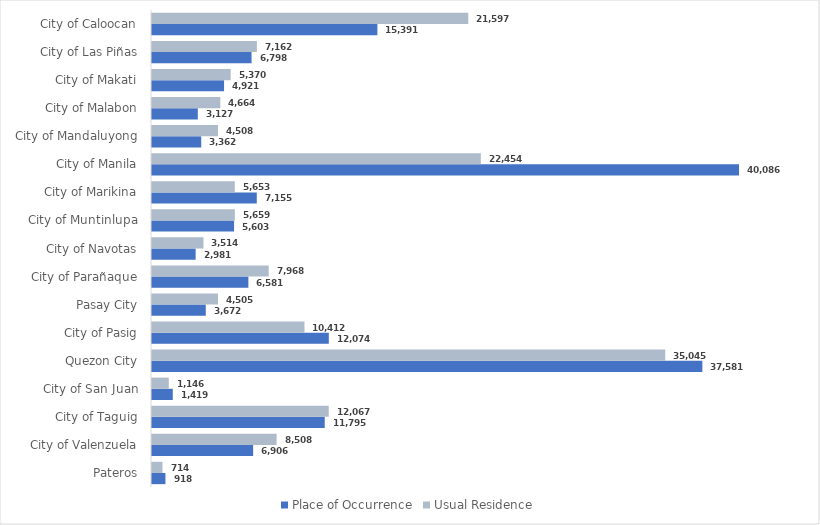
| Category |  Place of Occurrence  |  Usual Residence  |
|---|---|---|
|  Pateros | 918 | 714 |
|  City of Valenzuela | 6906 | 8508 |
|  City of Taguig | 11795 | 12067 |
|  City of San Juan | 1419 | 1146 |
|  Quezon City | 37581 | 35045 |
|  City of Pasig | 12074 | 10412 |
|  Pasay City | 3672 | 4505 |
|  City of Parañaque | 6581 | 7968 |
|  City of Navotas | 2981 | 3514 |
|  City of Muntinlupa | 5603 | 5659 |
|  City of Marikina | 7155 | 5653 |
|  City of Manila | 40086 | 22454 |
|  City of Mandaluyong | 3362 | 4508 |
|  City of Malabon | 3127 | 4664 |
|  City of Makati | 4921 | 5370 |
|  City of Las Piñas | 6798 | 7162 |
|  City of Caloocan | 15391 | 21597 |